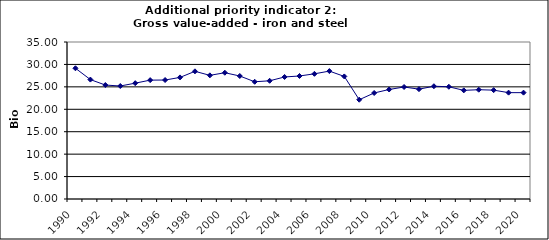
| Category | Gross value-added - iron and steel industry, Bio Euro (EC95) |
|---|---|
| 1990 | 29.143 |
| 1991 | 26.62 |
| 1992 | 25.407 |
| 1993 | 25.188 |
| 1994 | 25.819 |
| 1995 | 26.498 |
| 1996 | 26.523 |
| 1997 | 27.105 |
| 1998 | 28.464 |
| 1999 | 27.566 |
| 2000 | 28.149 |
| 2001 | 27.421 |
| 2002 | 26.135 |
| 2003 | 26.353 |
| 2004 | 27.202 |
| 2005 | 27.421 |
| 2006 | 27.906 |
| 2007 | 28.513 |
| 2008 | 27.324 |
| 2009 | 22.131 |
| 2010 | 23.635 |
| 2011 | 24.412 |
| 2012 | 24.97 |
| 2013 | 24.484 |
| 2014 | 25.14 |
| 2015 | 25.018 |
| 2016 | 24.217 |
| 2017 | 24.363 |
| 2018 | 24.266 |
| 2019 | 23.708 |
| 2020 | 23.708 |